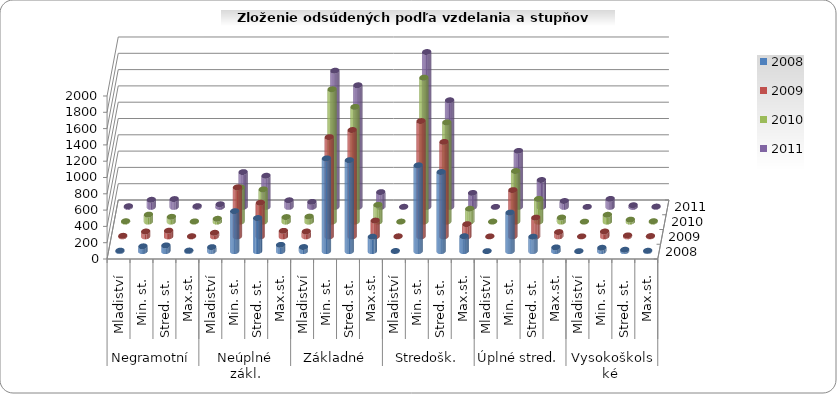
| Category | 2008 | 2009 | 2010 | 2011 |
|---|---|---|---|---|
| 0 | 6 | 7 | 5 | 8 |
| 1 | 59 | 60 | 86 | 87 |
| 2 | 70 | 70 | 59 | 96 |
| 3 | 7 | 2 | 3 | 9 |
| 4 | 49 | 44 | 35 | 32 |
| 5 | 490 | 602 | 419 | 427 |
| 6 | 406 | 413 | 396 | 382 |
| 7 | 77 | 68 | 56 | 81 |
| 8 | 50 | 60 | 62 | 61 |
| 9 | 1138 | 1218 | 1624 | 1671 |
| 10 | 1116 | 1305 | 1408 | 1492 |
| 11 | 177 | 194 | 206 | 181 |
| 12 | 2 | 1 | 1 | 1 |
| 13 | 1053 | 1415 | 1767 | 1900 |
| 14 | 971 | 1159 | 1218 | 1308 |
| 15 | 183 | 150 | 158 | 171 |
| 16 | 0 | 0 | 1 | 0 |
| 17 | 473 | 568 | 621 | 687 |
| 18 | 177 | 230 | 279 | 330 |
| 19 | 46 | 53 | 50 | 72 |
| 20 | 0 | 0 | 0 | 0 |
| 21 | 41 | 60 | 84 | 98 |
| 22 | 17 | 12 | 24 | 20 |
| 23 | 5 | 4 | 5 | 4 |